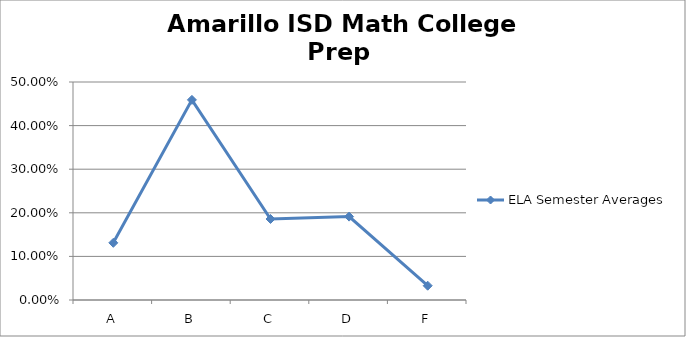
| Category | ELA Semester Averages |
|---|---|
| A | 0.131 |
| B | 0.459 |
| C | 0.186 |
| D | 0.191 |
| F | 0.033 |